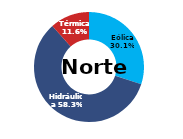
| Category | Norte |
|---|---|
| Eólica | 87.758 |
| Hidráulica | 170.119 |
| Solar | 0 |
| Térmica | 33.885 |